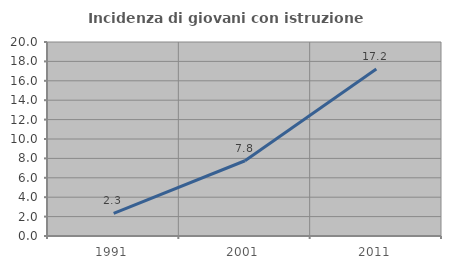
| Category | Incidenza di giovani con istruzione universitaria |
|---|---|
| 1991.0 | 2.334 |
| 2001.0 | 7.759 |
| 2011.0 | 17.219 |